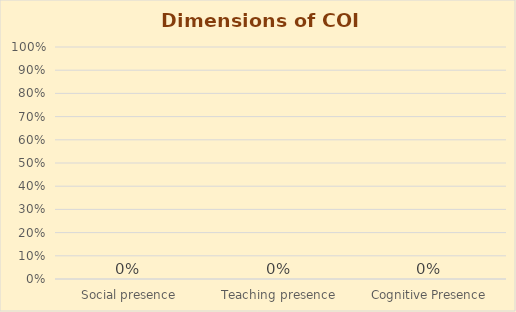
| Category | Series 0 |
|---|---|
| Social presence | 0 |
| Teaching presence | 0 |
| Cognitive Presence | 0 |